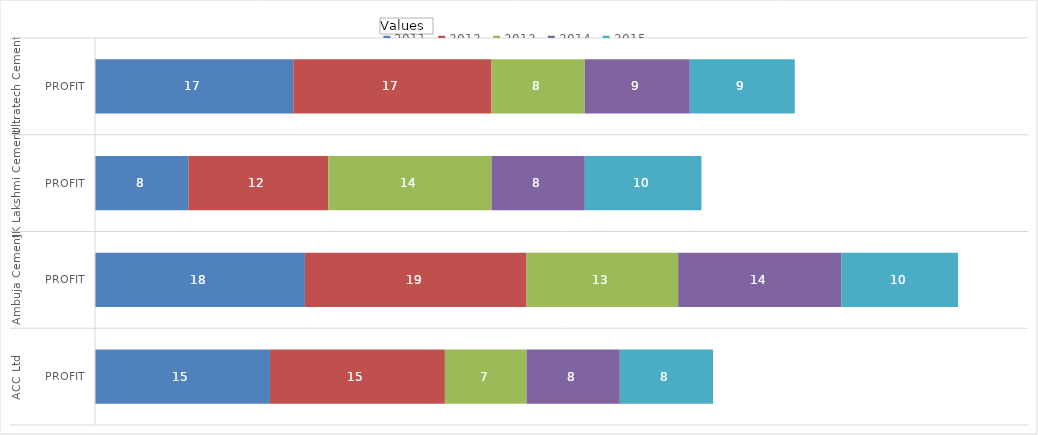
| Category | 2011  | 2012  | 2013  | 2014  | 2015  |
|---|---|---|---|---|---|
| 0 | 15 | 15 | 7 | 8 | 8 |
| 1 | 18 | 19 | 13 | 14 | 10 |
| 2 | 8 | 12 | 14 | 8 | 10 |
| 3 | 17 | 17 | 8 | 9 | 9 |